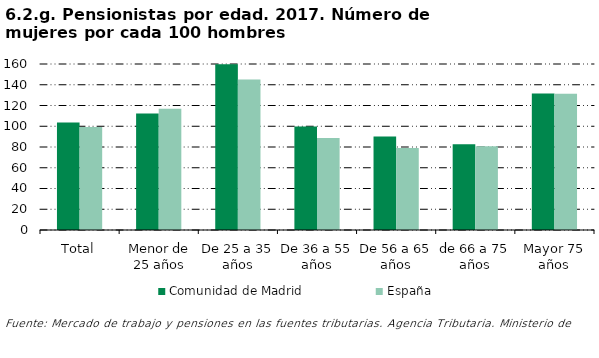
| Category | Comunidad de Madrid | España |
|---|---|---|
| Total | 103.612 | 99.234 |
| Menor de 25 años | 112.32 | 116.898 |
| De 25 a 35 años | 159.802 | 145.141 |
| De 36 a 55 años | 99.795 | 88.577 |
| De 56 a 65 años | 90.02 | 79.012 |
| de 66 a 75 años | 82.622 | 80.673 |
| Mayor 75 años | 131.544 | 131.366 |